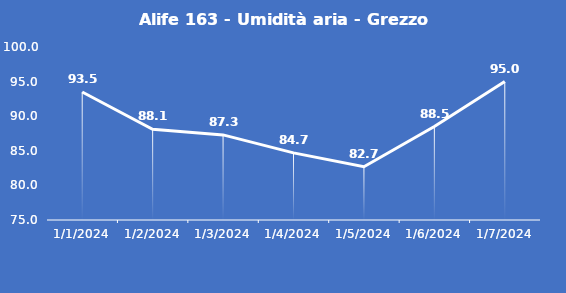
| Category | Alife 163 - Umidità aria - Grezzo (%) |
|---|---|
| 1/1/24 | 93.5 |
| 1/2/24 | 88.1 |
| 1/3/24 | 87.3 |
| 1/4/24 | 84.7 |
| 1/5/24 | 82.7 |
| 1/6/24 | 88.5 |
| 1/7/24 | 95 |